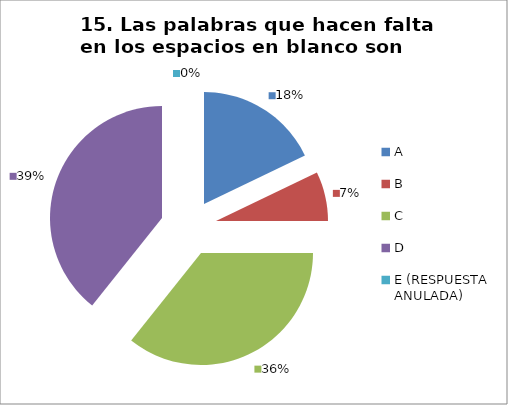
| Category | CANTIDAD DE RESPUESTAS PREGUNTA (15) | PORCENTAJE |
|---|---|---|
| A | 5 | 0.179 |
| B | 2 | 0.071 |
| C | 10 | 0.357 |
| D | 11 | 0.393 |
| E (RESPUESTA ANULADA) | 0 | 0 |